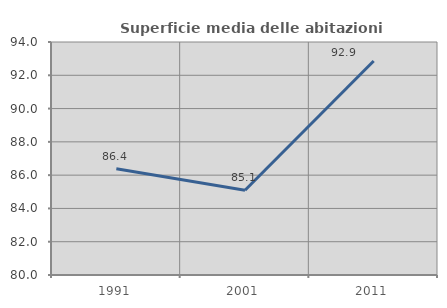
| Category | Superficie media delle abitazioni occupate |
|---|---|
| 1991.0 | 86.382 |
| 2001.0 | 85.092 |
| 2011.0 | 92.862 |